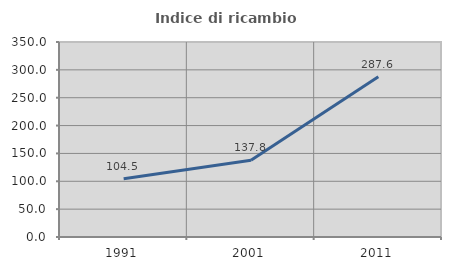
| Category | Indice di ricambio occupazionale  |
|---|---|
| 1991.0 | 104.545 |
| 2001.0 | 137.842 |
| 2011.0 | 287.613 |